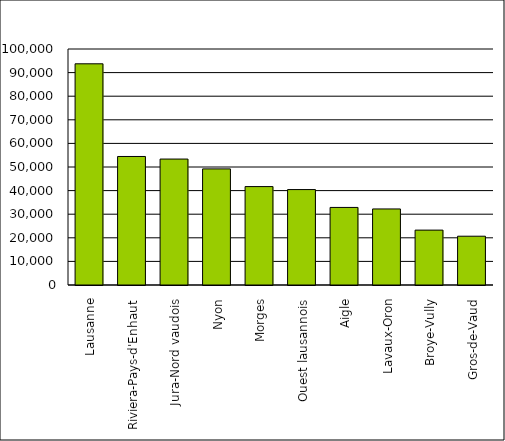
| Category | Series 0 |
|---|---|
| Lausanne | 93729 |
| Riviera-Pays-d'Enhaut | 54458 |
| Jura-Nord vaudois | 53368 |
| Nyon | 49203 |
| Morges | 41698 |
| Ouest lausannois | 40436 |
| Aigle | 32869 |
| Lavaux-Oron | 32227 |
| Broye-Vully | 23256 |
| Gros-de-Vaud | 20672 |